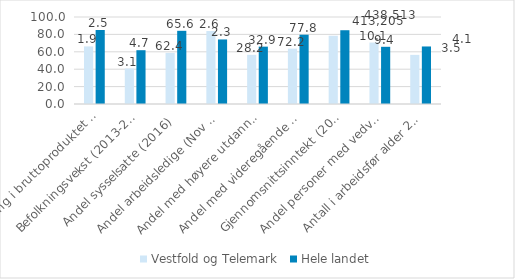
| Category | Vestfold og Telemark | Hele landet |
|---|---|---|
| Endring i bruttoproduktet (2010-2015) | 66.18 | 85.077 |
| Befolkningsvekst (2013-2018) | 40.789 | 61.842 |
| Andel sysselsatte (2016) | 58.73 | 84.127 |
| Andel arbeidsledige (Nov 2017) | 83.871 | 74.194 |
| Andel med høyere utdanning, 16 år og over (2016) | 56.513 | 65.932 |
| Andel med videregående og høyere utdanning, 25-29 år (2016) | 63.61 | 79.656 |
| Gjennomsnittsinntekt (2016) | 78.458 | 84.798 |
| Andel personer med vedvarende lavinntekt (2014-16) | 70.629 | 65.734 |
| Antall i arbeidsfør alder 20-66 år i forhold til eldre 67 år og over (2018) | 56.452 | 66.129 |